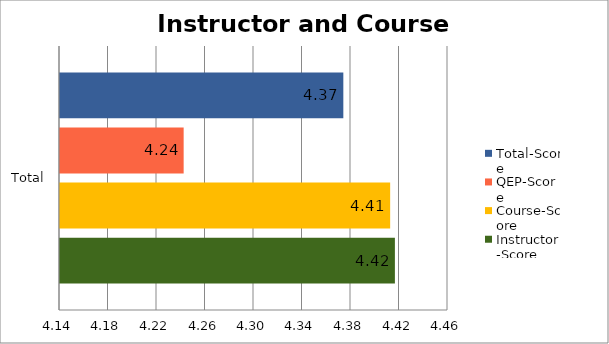
| Category | Instructor-Score | Course-Score | QEP-Score | Total-Score |
|---|---|---|---|---|
| Total | 4.416 | 4.412 | 4.242 | 4.374 |